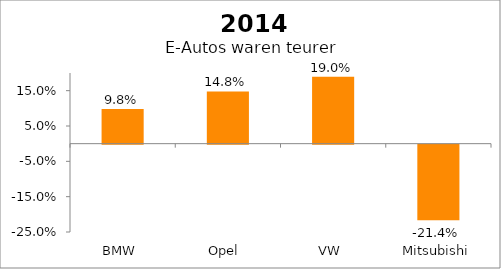
| Category | Series 0 |
|---|---|
| BMW  | 0.098 |
| Opel  | 0.148 |
| VW  | 0.19 |
| Mitsubishi | -0.214 |